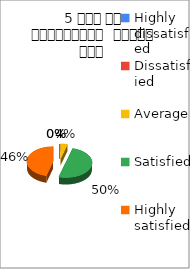
| Category | 5 समय पर पाठ्यक्रम  पूर्ण हुआ  |
|---|---|
| Highly dissatisfied | 0 |
| Dissatisfied | 0 |
| Average | 1 |
| Satisfied | 12 |
| Highly satisfied | 11 |